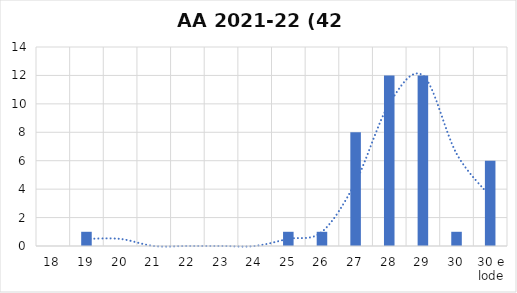
| Category | Series 0 |
|---|---|
| 18 | 0 |
| 19 | 1 |
| 20 | 0 |
| 21 | 0 |
| 22 | 0 |
| 23 | 0 |
| 24 | 0 |
| 25 | 1 |
| 26 | 1 |
| 27 | 8 |
| 28 | 12 |
| 29 | 12 |
| 30 | 1 |
| 30 e lode | 6 |